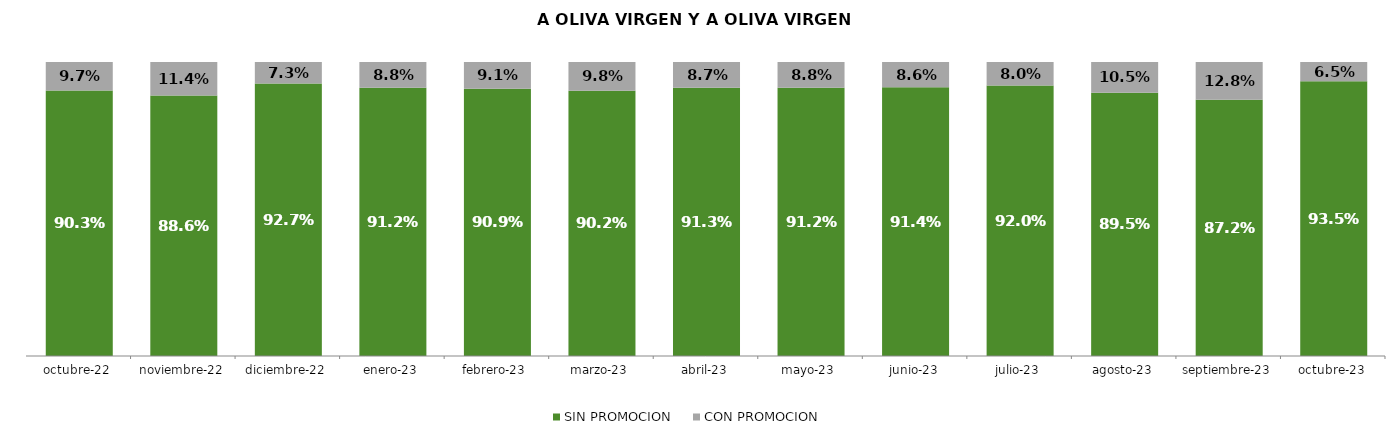
| Category | SIN PROMOCION   | CON PROMOCION   |
|---|---|---|
| 2022-10-01 | 0.903 | 0.097 |
| 2022-11-01 | 0.886 | 0.114 |
| 2022-12-01 | 0.927 | 0.073 |
| 2023-01-01 | 0.912 | 0.088 |
| 2023-02-01 | 0.909 | 0.091 |
| 2023-03-01 | 0.902 | 0.098 |
| 2023-04-01 | 0.913 | 0.087 |
| 2023-05-01 | 0.912 | 0.088 |
| 2023-06-01 | 0.914 | 0.086 |
| 2023-07-01 | 0.92 | 0.08 |
| 2023-08-01 | 0.895 | 0.105 |
| 2023-09-01 | 0.872 | 0.128 |
| 2023-10-01 | 0.935 | 0.065 |